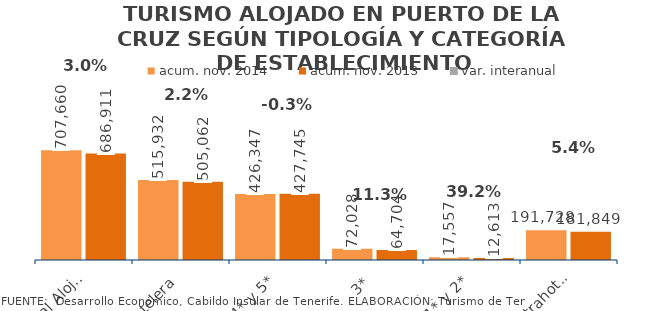
| Category | acum. nov. 2014 | acum. nov. 2013 |
|---|---|---|
| Total Alojados | 707660 | 686911 |
| Hotelera | 515932 | 505062 |
| 4* y 5* | 426347 | 427745 |
| 3* | 72028 | 64704 |
| 1* y 2* | 17557 | 12613 |
| Extrahotelera | 191728 | 181849 |